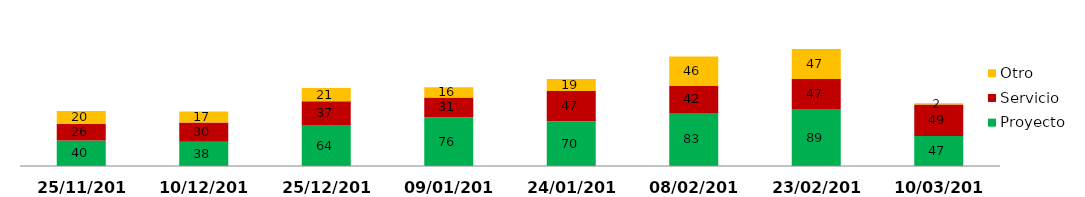
| Category | Proyecto | Servicio | Otro |
|---|---|---|---|
| 25/11/2013 | 40 | 26 | 20 |
| 10/12/2013 | 38 | 30 | 17 |
| 25/12/2013 | 64 | 37 | 21 |
| 09/01/2014 | 76 | 31 | 16 |
| 24/01/2014 | 70 | 47 | 19 |
| 08/02/2014 | 83 | 42 | 46 |
| 23/02/2014 | 89 | 47 | 47 |
| 10/03/2014 | 47 | 49 | 2 |